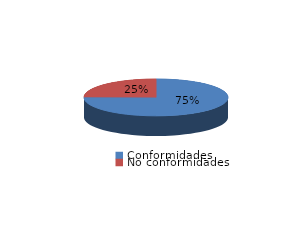
| Category | Series 0 |
|---|---|
| Conformidades | 1376 |
| No conformidades | 456 |